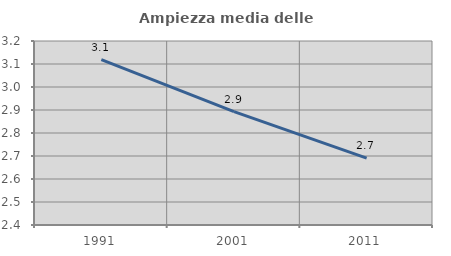
| Category | Ampiezza media delle famiglie |
|---|---|
| 1991.0 | 3.119 |
| 2001.0 | 2.893 |
| 2011.0 | 2.691 |